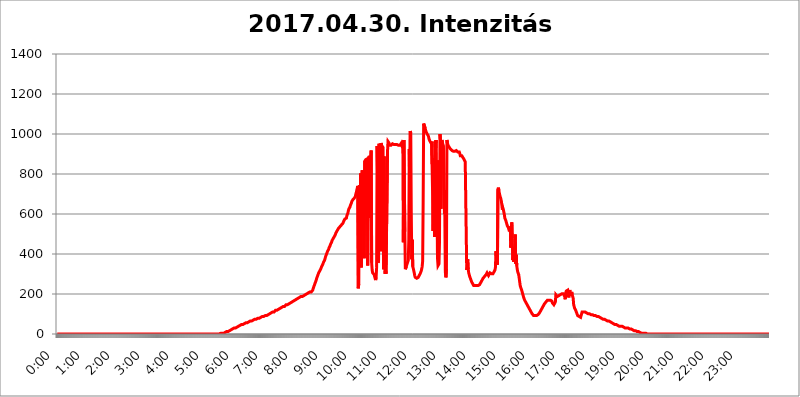
| Category | 2017.04.30. Intenzitás [W/m^2] |
|---|---|
| 0.0 | 0 |
| 0.0006944444444444445 | 0 |
| 0.001388888888888889 | 0 |
| 0.0020833333333333333 | 0 |
| 0.002777777777777778 | 0 |
| 0.003472222222222222 | 0 |
| 0.004166666666666667 | 0 |
| 0.004861111111111111 | 0 |
| 0.005555555555555556 | 0 |
| 0.0062499999999999995 | 0 |
| 0.006944444444444444 | 0 |
| 0.007638888888888889 | 0 |
| 0.008333333333333333 | 0 |
| 0.009027777777777779 | 0 |
| 0.009722222222222222 | 0 |
| 0.010416666666666666 | 0 |
| 0.011111111111111112 | 0 |
| 0.011805555555555555 | 0 |
| 0.012499999999999999 | 0 |
| 0.013194444444444444 | 0 |
| 0.013888888888888888 | 0 |
| 0.014583333333333332 | 0 |
| 0.015277777777777777 | 0 |
| 0.015972222222222224 | 0 |
| 0.016666666666666666 | 0 |
| 0.017361111111111112 | 0 |
| 0.018055555555555557 | 0 |
| 0.01875 | 0 |
| 0.019444444444444445 | 0 |
| 0.02013888888888889 | 0 |
| 0.020833333333333332 | 0 |
| 0.02152777777777778 | 0 |
| 0.022222222222222223 | 0 |
| 0.02291666666666667 | 0 |
| 0.02361111111111111 | 0 |
| 0.024305555555555556 | 0 |
| 0.024999999999999998 | 0 |
| 0.025694444444444447 | 0 |
| 0.02638888888888889 | 0 |
| 0.027083333333333334 | 0 |
| 0.027777777777777776 | 0 |
| 0.02847222222222222 | 0 |
| 0.029166666666666664 | 0 |
| 0.029861111111111113 | 0 |
| 0.030555555555555555 | 0 |
| 0.03125 | 0 |
| 0.03194444444444445 | 0 |
| 0.03263888888888889 | 0 |
| 0.03333333333333333 | 0 |
| 0.034027777777777775 | 0 |
| 0.034722222222222224 | 0 |
| 0.035416666666666666 | 0 |
| 0.036111111111111115 | 0 |
| 0.03680555555555556 | 0 |
| 0.0375 | 0 |
| 0.03819444444444444 | 0 |
| 0.03888888888888889 | 0 |
| 0.03958333333333333 | 0 |
| 0.04027777777777778 | 0 |
| 0.04097222222222222 | 0 |
| 0.041666666666666664 | 0 |
| 0.042361111111111106 | 0 |
| 0.04305555555555556 | 0 |
| 0.043750000000000004 | 0 |
| 0.044444444444444446 | 0 |
| 0.04513888888888889 | 0 |
| 0.04583333333333334 | 0 |
| 0.04652777777777778 | 0 |
| 0.04722222222222222 | 0 |
| 0.04791666666666666 | 0 |
| 0.04861111111111111 | 0 |
| 0.049305555555555554 | 0 |
| 0.049999999999999996 | 0 |
| 0.05069444444444445 | 0 |
| 0.051388888888888894 | 0 |
| 0.052083333333333336 | 0 |
| 0.05277777777777778 | 0 |
| 0.05347222222222222 | 0 |
| 0.05416666666666667 | 0 |
| 0.05486111111111111 | 0 |
| 0.05555555555555555 | 0 |
| 0.05625 | 0 |
| 0.05694444444444444 | 0 |
| 0.057638888888888885 | 0 |
| 0.05833333333333333 | 0 |
| 0.05902777777777778 | 0 |
| 0.059722222222222225 | 0 |
| 0.06041666666666667 | 0 |
| 0.061111111111111116 | 0 |
| 0.06180555555555556 | 0 |
| 0.0625 | 0 |
| 0.06319444444444444 | 0 |
| 0.06388888888888888 | 0 |
| 0.06458333333333334 | 0 |
| 0.06527777777777778 | 0 |
| 0.06597222222222222 | 0 |
| 0.06666666666666667 | 0 |
| 0.06736111111111111 | 0 |
| 0.06805555555555555 | 0 |
| 0.06874999999999999 | 0 |
| 0.06944444444444443 | 0 |
| 0.07013888888888889 | 0 |
| 0.07083333333333333 | 0 |
| 0.07152777777777779 | 0 |
| 0.07222222222222223 | 0 |
| 0.07291666666666667 | 0 |
| 0.07361111111111111 | 0 |
| 0.07430555555555556 | 0 |
| 0.075 | 0 |
| 0.07569444444444444 | 0 |
| 0.0763888888888889 | 0 |
| 0.07708333333333334 | 0 |
| 0.07777777777777778 | 0 |
| 0.07847222222222222 | 0 |
| 0.07916666666666666 | 0 |
| 0.0798611111111111 | 0 |
| 0.08055555555555556 | 0 |
| 0.08125 | 0 |
| 0.08194444444444444 | 0 |
| 0.08263888888888889 | 0 |
| 0.08333333333333333 | 0 |
| 0.08402777777777777 | 0 |
| 0.08472222222222221 | 0 |
| 0.08541666666666665 | 0 |
| 0.08611111111111112 | 0 |
| 0.08680555555555557 | 0 |
| 0.08750000000000001 | 0 |
| 0.08819444444444445 | 0 |
| 0.08888888888888889 | 0 |
| 0.08958333333333333 | 0 |
| 0.09027777777777778 | 0 |
| 0.09097222222222222 | 0 |
| 0.09166666666666667 | 0 |
| 0.09236111111111112 | 0 |
| 0.09305555555555556 | 0 |
| 0.09375 | 0 |
| 0.09444444444444444 | 0 |
| 0.09513888888888888 | 0 |
| 0.09583333333333333 | 0 |
| 0.09652777777777777 | 0 |
| 0.09722222222222222 | 0 |
| 0.09791666666666667 | 0 |
| 0.09861111111111111 | 0 |
| 0.09930555555555555 | 0 |
| 0.09999999999999999 | 0 |
| 0.10069444444444443 | 0 |
| 0.1013888888888889 | 0 |
| 0.10208333333333335 | 0 |
| 0.10277777777777779 | 0 |
| 0.10347222222222223 | 0 |
| 0.10416666666666667 | 0 |
| 0.10486111111111111 | 0 |
| 0.10555555555555556 | 0 |
| 0.10625 | 0 |
| 0.10694444444444444 | 0 |
| 0.1076388888888889 | 0 |
| 0.10833333333333334 | 0 |
| 0.10902777777777778 | 0 |
| 0.10972222222222222 | 0 |
| 0.1111111111111111 | 0 |
| 0.11180555555555556 | 0 |
| 0.11180555555555556 | 0 |
| 0.1125 | 0 |
| 0.11319444444444444 | 0 |
| 0.11388888888888889 | 0 |
| 0.11458333333333333 | 0 |
| 0.11527777777777777 | 0 |
| 0.11597222222222221 | 0 |
| 0.11666666666666665 | 0 |
| 0.1173611111111111 | 0 |
| 0.11805555555555557 | 0 |
| 0.11944444444444445 | 0 |
| 0.12013888888888889 | 0 |
| 0.12083333333333333 | 0 |
| 0.12152777777777778 | 0 |
| 0.12222222222222223 | 0 |
| 0.12291666666666667 | 0 |
| 0.12291666666666667 | 0 |
| 0.12361111111111112 | 0 |
| 0.12430555555555556 | 0 |
| 0.125 | 0 |
| 0.12569444444444444 | 0 |
| 0.12638888888888888 | 0 |
| 0.12708333333333333 | 0 |
| 0.16875 | 0 |
| 0.12847222222222224 | 0 |
| 0.12916666666666668 | 0 |
| 0.12986111111111112 | 0 |
| 0.13055555555555556 | 0 |
| 0.13125 | 0 |
| 0.13194444444444445 | 0 |
| 0.1326388888888889 | 0 |
| 0.13333333333333333 | 0 |
| 0.13402777777777777 | 0 |
| 0.13402777777777777 | 0 |
| 0.13472222222222222 | 0 |
| 0.13541666666666666 | 0 |
| 0.1361111111111111 | 0 |
| 0.13749999999999998 | 0 |
| 0.13819444444444443 | 0 |
| 0.1388888888888889 | 0 |
| 0.13958333333333334 | 0 |
| 0.14027777777777778 | 0 |
| 0.14097222222222222 | 0 |
| 0.14166666666666666 | 0 |
| 0.1423611111111111 | 0 |
| 0.14305555555555557 | 0 |
| 0.14375000000000002 | 0 |
| 0.14444444444444446 | 0 |
| 0.1451388888888889 | 0 |
| 0.1451388888888889 | 0 |
| 0.14652777777777778 | 0 |
| 0.14722222222222223 | 0 |
| 0.14791666666666667 | 0 |
| 0.1486111111111111 | 0 |
| 0.14930555555555555 | 0 |
| 0.15 | 0 |
| 0.15069444444444444 | 0 |
| 0.15138888888888888 | 0 |
| 0.15208333333333332 | 0 |
| 0.15277777777777776 | 0 |
| 0.15347222222222223 | 0 |
| 0.15416666666666667 | 0 |
| 0.15486111111111112 | 0 |
| 0.15555555555555556 | 0 |
| 0.15625 | 0 |
| 0.15694444444444444 | 0 |
| 0.15763888888888888 | 0 |
| 0.15833333333333333 | 0 |
| 0.15902777777777777 | 0 |
| 0.15972222222222224 | 0 |
| 0.16041666666666668 | 0 |
| 0.16111111111111112 | 0 |
| 0.16180555555555556 | 0 |
| 0.1625 | 0 |
| 0.16319444444444445 | 0 |
| 0.1638888888888889 | 0 |
| 0.16458333333333333 | 0 |
| 0.16527777777777777 | 0 |
| 0.16597222222222222 | 0 |
| 0.16666666666666666 | 0 |
| 0.1673611111111111 | 0 |
| 0.16805555555555554 | 0 |
| 0.16874999999999998 | 0 |
| 0.16944444444444443 | 0 |
| 0.17013888888888887 | 0 |
| 0.1708333333333333 | 0 |
| 0.17152777777777775 | 0 |
| 0.17222222222222225 | 0 |
| 0.1729166666666667 | 0 |
| 0.17361111111111113 | 0 |
| 0.17430555555555557 | 0 |
| 0.17500000000000002 | 0 |
| 0.17569444444444446 | 0 |
| 0.1763888888888889 | 0 |
| 0.17708333333333334 | 0 |
| 0.17777777777777778 | 0 |
| 0.17847222222222223 | 0 |
| 0.17916666666666667 | 0 |
| 0.1798611111111111 | 0 |
| 0.18055555555555555 | 0 |
| 0.18125 | 0 |
| 0.18194444444444444 | 0 |
| 0.1826388888888889 | 0 |
| 0.18333333333333335 | 0 |
| 0.1840277777777778 | 0 |
| 0.18472222222222223 | 0 |
| 0.18541666666666667 | 0 |
| 0.18611111111111112 | 0 |
| 0.18680555555555556 | 0 |
| 0.1875 | 0 |
| 0.18819444444444444 | 0 |
| 0.18888888888888888 | 0 |
| 0.18958333333333333 | 0 |
| 0.19027777777777777 | 0 |
| 0.1909722222222222 | 0 |
| 0.19166666666666665 | 0 |
| 0.19236111111111112 | 0 |
| 0.19305555555555554 | 0 |
| 0.19375 | 0 |
| 0.19444444444444445 | 0 |
| 0.1951388888888889 | 0 |
| 0.19583333333333333 | 0 |
| 0.19652777777777777 | 0 |
| 0.19722222222222222 | 0 |
| 0.19791666666666666 | 0 |
| 0.1986111111111111 | 0 |
| 0.19930555555555554 | 0 |
| 0.19999999999999998 | 0 |
| 0.20069444444444443 | 0 |
| 0.20138888888888887 | 0 |
| 0.2020833333333333 | 0 |
| 0.2027777777777778 | 0 |
| 0.2034722222222222 | 0 |
| 0.2041666666666667 | 0 |
| 0.20486111111111113 | 0 |
| 0.20555555555555557 | 0 |
| 0.20625000000000002 | 0 |
| 0.20694444444444446 | 0 |
| 0.2076388888888889 | 0 |
| 0.20833333333333334 | 0 |
| 0.20902777777777778 | 0 |
| 0.20972222222222223 | 0 |
| 0.21041666666666667 | 0 |
| 0.2111111111111111 | 0 |
| 0.21180555555555555 | 0 |
| 0.2125 | 0 |
| 0.21319444444444444 | 0 |
| 0.2138888888888889 | 0 |
| 0.21458333333333335 | 0 |
| 0.2152777777777778 | 0 |
| 0.21597222222222223 | 0 |
| 0.21666666666666667 | 0 |
| 0.21736111111111112 | 0 |
| 0.21805555555555556 | 0 |
| 0.21875 | 0 |
| 0.21944444444444444 | 0 |
| 0.22013888888888888 | 0 |
| 0.22083333333333333 | 0 |
| 0.22152777777777777 | 0 |
| 0.2222222222222222 | 0 |
| 0.22291666666666665 | 0 |
| 0.2236111111111111 | 0 |
| 0.22430555555555556 | 0 |
| 0.225 | 0 |
| 0.22569444444444445 | 0 |
| 0.2263888888888889 | 0 |
| 0.22708333333333333 | 0 |
| 0.22777777777777777 | 3.525 |
| 0.22847222222222222 | 3.525 |
| 0.22916666666666666 | 3.525 |
| 0.2298611111111111 | 3.525 |
| 0.23055555555555554 | 3.525 |
| 0.23124999999999998 | 3.525 |
| 0.23194444444444443 | 3.525 |
| 0.23263888888888887 | 3.525 |
| 0.2333333333333333 | 3.525 |
| 0.2340277777777778 | 7.887 |
| 0.2347222222222222 | 7.887 |
| 0.2354166666666667 | 7.887 |
| 0.23611111111111113 | 7.887 |
| 0.23680555555555557 | 12.257 |
| 0.23750000000000002 | 12.257 |
| 0.23819444444444446 | 12.257 |
| 0.2388888888888889 | 12.257 |
| 0.23958333333333334 | 12.257 |
| 0.24027777777777778 | 16.636 |
| 0.24097222222222223 | 16.636 |
| 0.24166666666666667 | 16.636 |
| 0.2423611111111111 | 16.636 |
| 0.24305555555555555 | 21.024 |
| 0.24375 | 21.024 |
| 0.24444444444444446 | 21.024 |
| 0.24513888888888888 | 21.024 |
| 0.24583333333333335 | 25.419 |
| 0.2465277777777778 | 25.419 |
| 0.24722222222222223 | 25.419 |
| 0.24791666666666667 | 29.823 |
| 0.24861111111111112 | 29.823 |
| 0.24930555555555556 | 29.823 |
| 0.25 | 29.823 |
| 0.25069444444444444 | 29.823 |
| 0.2513888888888889 | 34.234 |
| 0.2520833333333333 | 34.234 |
| 0.25277777777777777 | 38.653 |
| 0.2534722222222222 | 38.653 |
| 0.25416666666666665 | 38.653 |
| 0.2548611111111111 | 38.653 |
| 0.2555555555555556 | 38.653 |
| 0.25625000000000003 | 43.079 |
| 0.2569444444444445 | 43.079 |
| 0.2576388888888889 | 43.079 |
| 0.25833333333333336 | 47.511 |
| 0.2590277777777778 | 47.511 |
| 0.25972222222222224 | 47.511 |
| 0.2604166666666667 | 47.511 |
| 0.2611111111111111 | 47.511 |
| 0.26180555555555557 | 51.951 |
| 0.2625 | 51.951 |
| 0.26319444444444445 | 51.951 |
| 0.2638888888888889 | 56.398 |
| 0.26458333333333334 | 56.398 |
| 0.2652777777777778 | 56.398 |
| 0.2659722222222222 | 56.398 |
| 0.26666666666666666 | 56.398 |
| 0.2673611111111111 | 60.85 |
| 0.26805555555555555 | 60.85 |
| 0.26875 | 60.85 |
| 0.26944444444444443 | 60.85 |
| 0.2701388888888889 | 65.31 |
| 0.2708333333333333 | 65.31 |
| 0.27152777777777776 | 65.31 |
| 0.2722222222222222 | 65.31 |
| 0.27291666666666664 | 65.31 |
| 0.2736111111111111 | 69.775 |
| 0.2743055555555555 | 69.775 |
| 0.27499999999999997 | 69.775 |
| 0.27569444444444446 | 74.246 |
| 0.27638888888888885 | 74.246 |
| 0.27708333333333335 | 74.246 |
| 0.2777777777777778 | 74.246 |
| 0.27847222222222223 | 74.246 |
| 0.2791666666666667 | 74.246 |
| 0.2798611111111111 | 74.246 |
| 0.28055555555555556 | 74.246 |
| 0.28125 | 78.722 |
| 0.28194444444444444 | 78.722 |
| 0.2826388888888889 | 78.722 |
| 0.2833333333333333 | 78.722 |
| 0.28402777777777777 | 83.205 |
| 0.2847222222222222 | 83.205 |
| 0.28541666666666665 | 83.205 |
| 0.28611111111111115 | 83.205 |
| 0.28680555555555554 | 83.205 |
| 0.28750000000000003 | 87.692 |
| 0.2881944444444445 | 87.692 |
| 0.2888888888888889 | 87.692 |
| 0.28958333333333336 | 87.692 |
| 0.2902777777777778 | 87.692 |
| 0.29097222222222224 | 92.184 |
| 0.2916666666666667 | 92.184 |
| 0.2923611111111111 | 92.184 |
| 0.29305555555555557 | 92.184 |
| 0.29375 | 92.184 |
| 0.29444444444444445 | 96.682 |
| 0.2951388888888889 | 96.682 |
| 0.29583333333333334 | 96.682 |
| 0.2965277777777778 | 101.184 |
| 0.2972222222222222 | 101.184 |
| 0.29791666666666666 | 101.184 |
| 0.2986111111111111 | 101.184 |
| 0.29930555555555555 | 101.184 |
| 0.3 | 105.69 |
| 0.30069444444444443 | 105.69 |
| 0.3013888888888889 | 110.201 |
| 0.3020833333333333 | 110.201 |
| 0.30277777777777776 | 110.201 |
| 0.3034722222222222 | 110.201 |
| 0.30416666666666664 | 110.201 |
| 0.3048611111111111 | 114.716 |
| 0.3055555555555555 | 114.716 |
| 0.30624999999999997 | 119.235 |
| 0.3069444444444444 | 119.235 |
| 0.3076388888888889 | 119.235 |
| 0.30833333333333335 | 119.235 |
| 0.3090277777777778 | 119.235 |
| 0.30972222222222223 | 119.235 |
| 0.3104166666666667 | 123.758 |
| 0.3111111111111111 | 123.758 |
| 0.31180555555555556 | 123.758 |
| 0.3125 | 128.284 |
| 0.31319444444444444 | 128.284 |
| 0.3138888888888889 | 128.284 |
| 0.3145833333333333 | 132.814 |
| 0.31527777777777777 | 132.814 |
| 0.3159722222222222 | 132.814 |
| 0.31666666666666665 | 137.347 |
| 0.31736111111111115 | 137.347 |
| 0.31805555555555554 | 137.347 |
| 0.31875000000000003 | 137.347 |
| 0.3194444444444445 | 141.884 |
| 0.3201388888888889 | 141.884 |
| 0.32083333333333336 | 146.423 |
| 0.3215277777777778 | 146.423 |
| 0.32222222222222224 | 146.423 |
| 0.3229166666666667 | 146.423 |
| 0.3236111111111111 | 146.423 |
| 0.32430555555555557 | 150.964 |
| 0.325 | 150.964 |
| 0.32569444444444445 | 155.509 |
| 0.3263888888888889 | 155.509 |
| 0.32708333333333334 | 155.509 |
| 0.3277777777777778 | 155.509 |
| 0.3284722222222222 | 160.056 |
| 0.32916666666666666 | 160.056 |
| 0.3298611111111111 | 160.056 |
| 0.33055555555555555 | 164.605 |
| 0.33125 | 164.605 |
| 0.33194444444444443 | 164.605 |
| 0.3326388888888889 | 164.605 |
| 0.3333333333333333 | 169.156 |
| 0.3340277777777778 | 169.156 |
| 0.3347222222222222 | 173.709 |
| 0.3354166666666667 | 173.709 |
| 0.3361111111111111 | 173.709 |
| 0.3368055555555556 | 173.709 |
| 0.33749999999999997 | 178.264 |
| 0.33819444444444446 | 178.264 |
| 0.33888888888888885 | 182.82 |
| 0.33958333333333335 | 182.82 |
| 0.34027777777777773 | 182.82 |
| 0.34097222222222223 | 182.82 |
| 0.3416666666666666 | 187.378 |
| 0.3423611111111111 | 187.378 |
| 0.3430555555555555 | 187.378 |
| 0.34375 | 187.378 |
| 0.3444444444444445 | 191.937 |
| 0.3451388888888889 | 191.937 |
| 0.3458333333333334 | 191.937 |
| 0.34652777777777777 | 191.937 |
| 0.34722222222222227 | 196.497 |
| 0.34791666666666665 | 196.497 |
| 0.34861111111111115 | 196.497 |
| 0.34930555555555554 | 201.058 |
| 0.35000000000000003 | 201.058 |
| 0.3506944444444444 | 201.058 |
| 0.3513888888888889 | 205.62 |
| 0.3520833333333333 | 205.62 |
| 0.3527777777777778 | 205.62 |
| 0.3534722222222222 | 205.62 |
| 0.3541666666666667 | 210.182 |
| 0.3548611111111111 | 210.182 |
| 0.35555555555555557 | 210.182 |
| 0.35625 | 210.182 |
| 0.35694444444444445 | 214.746 |
| 0.3576388888888889 | 214.746 |
| 0.35833333333333334 | 219.309 |
| 0.3590277777777778 | 228.436 |
| 0.3597222222222222 | 233 |
| 0.36041666666666666 | 242.127 |
| 0.3611111111111111 | 246.689 |
| 0.36180555555555555 | 255.813 |
| 0.3625 | 260.373 |
| 0.36319444444444443 | 269.49 |
| 0.3638888888888889 | 278.603 |
| 0.3645833333333333 | 283.156 |
| 0.3652777777777778 | 292.259 |
| 0.3659722222222222 | 296.808 |
| 0.3666666666666667 | 305.898 |
| 0.3673611111111111 | 310.44 |
| 0.3680555555555556 | 314.98 |
| 0.36874999999999997 | 319.517 |
| 0.36944444444444446 | 324.052 |
| 0.37013888888888885 | 328.584 |
| 0.37083333333333335 | 337.639 |
| 0.37152777777777773 | 342.162 |
| 0.37222222222222223 | 346.682 |
| 0.3729166666666666 | 351.198 |
| 0.3736111111111111 | 360.221 |
| 0.3743055555555555 | 364.728 |
| 0.375 | 369.23 |
| 0.3756944444444445 | 378.224 |
| 0.3763888888888889 | 387.202 |
| 0.3770833333333334 | 391.685 |
| 0.37777777777777777 | 400.638 |
| 0.37847222222222227 | 405.108 |
| 0.37916666666666665 | 414.035 |
| 0.37986111111111115 | 418.492 |
| 0.38055555555555554 | 422.943 |
| 0.38125000000000003 | 431.833 |
| 0.3819444444444444 | 436.27 |
| 0.3826388888888889 | 440.702 |
| 0.3833333333333333 | 449.551 |
| 0.3840277777777778 | 453.968 |
| 0.3847222222222222 | 458.38 |
| 0.3854166666666667 | 467.187 |
| 0.3861111111111111 | 471.582 |
| 0.38680555555555557 | 475.972 |
| 0.3875 | 480.356 |
| 0.38819444444444445 | 484.735 |
| 0.3888888888888889 | 489.108 |
| 0.38958333333333334 | 493.475 |
| 0.3902777777777778 | 497.836 |
| 0.3909722222222222 | 506.542 |
| 0.39166666666666666 | 506.542 |
| 0.3923611111111111 | 515.223 |
| 0.39305555555555555 | 515.223 |
| 0.39375 | 519.555 |
| 0.39444444444444443 | 528.2 |
| 0.3951388888888889 | 528.2 |
| 0.3958333333333333 | 532.513 |
| 0.3965277777777778 | 536.82 |
| 0.3972222222222222 | 536.82 |
| 0.3979166666666667 | 541.121 |
| 0.3986111111111111 | 545.416 |
| 0.3993055555555556 | 549.704 |
| 0.39999999999999997 | 549.704 |
| 0.40069444444444446 | 553.986 |
| 0.40138888888888885 | 558.261 |
| 0.40208333333333335 | 566.793 |
| 0.40277777777777773 | 571.049 |
| 0.40347222222222223 | 575.299 |
| 0.4041666666666666 | 575.299 |
| 0.4048611111111111 | 575.299 |
| 0.4055555555555555 | 579.542 |
| 0.40625 | 592.233 |
| 0.4069444444444445 | 592.233 |
| 0.4076388888888889 | 604.864 |
| 0.4083333333333334 | 617.436 |
| 0.40902777777777777 | 625.784 |
| 0.40972222222222227 | 625.784 |
| 0.41041666666666665 | 634.105 |
| 0.41111111111111115 | 642.4 |
| 0.41180555555555554 | 646.537 |
| 0.41250000000000003 | 654.791 |
| 0.4131944444444444 | 663.019 |
| 0.4138888888888889 | 667.123 |
| 0.4145833333333333 | 671.22 |
| 0.4152777777777778 | 675.311 |
| 0.4159722222222222 | 675.311 |
| 0.4166666666666667 | 679.395 |
| 0.4173611111111111 | 683.473 |
| 0.41805555555555557 | 687.544 |
| 0.41875 | 699.717 |
| 0.41944444444444445 | 707.8 |
| 0.4201388888888889 | 719.877 |
| 0.42083333333333334 | 723.889 |
| 0.4215277777777778 | 739.877 |
| 0.4222222222222222 | 228.436 |
| 0.42291666666666666 | 251.251 |
| 0.4236111111111111 | 743.859 |
| 0.42430555555555555 | 414.035 |
| 0.425 | 400.638 |
| 0.42569444444444443 | 802.868 |
| 0.4263888888888889 | 333.113 |
| 0.4270833333333333 | 763.674 |
| 0.4277777777777778 | 818.392 |
| 0.4284722222222222 | 755.766 |
| 0.4291666666666667 | 814.519 |
| 0.4298611111111111 | 791.169 |
| 0.4305555555555556 | 378.224 |
| 0.43124999999999997 | 864.493 |
| 0.43194444444444446 | 868.305 |
| 0.43263888888888885 | 872.114 |
| 0.43333333333333335 | 868.305 |
| 0.43402777777777773 | 868.305 |
| 0.43472222222222223 | 875.918 |
| 0.4354166666666666 | 342.162 |
| 0.4361111111111111 | 751.803 |
| 0.4368055555555555 | 822.26 |
| 0.4375 | 891.099 |
| 0.4381944444444445 | 868.305 |
| 0.4388888888888889 | 579.542 |
| 0.4395833333333334 | 883.516 |
| 0.44027777777777777 | 917.534 |
| 0.44097222222222227 | 355.712 |
| 0.44166666666666665 | 319.517 |
| 0.44236111111111115 | 305.898 |
| 0.44305555555555554 | 305.898 |
| 0.44375000000000003 | 305.898 |
| 0.4444444444444444 | 296.808 |
| 0.4451388888888889 | 292.259 |
| 0.4458333333333333 | 278.603 |
| 0.4465277777777778 | 269.49 |
| 0.4472222222222222 | 283.156 |
| 0.4479166666666667 | 333.113 |
| 0.4486111111111111 | 940.082 |
| 0.44930555555555557 | 783.342 |
| 0.45 | 355.712 |
| 0.45069444444444445 | 369.23 |
| 0.4513888888888889 | 951.327 |
| 0.45208333333333334 | 687.544 |
| 0.4527777777777778 | 583.779 |
| 0.4534722222222222 | 414.035 |
| 0.45416666666666666 | 955.071 |
| 0.4548611111111111 | 943.832 |
| 0.45555555555555555 | 940.082 |
| 0.45625 | 940.082 |
| 0.45694444444444443 | 932.576 |
| 0.4576388888888889 | 324.052 |
| 0.4583333333333333 | 887.309 |
| 0.4590277777777778 | 369.23 |
| 0.4597222222222222 | 301.354 |
| 0.4604166666666667 | 319.517 |
| 0.4611111111111111 | 301.354 |
| 0.4618055555555556 | 305.898 |
| 0.46249999999999997 | 296.808 |
| 0.46319444444444446 | 909.996 |
| 0.46388888888888885 | 962.555 |
| 0.46458333333333335 | 962.555 |
| 0.46527777777777773 | 955.071 |
| 0.46597222222222223 | 943.832 |
| 0.4666666666666666 | 947.58 |
| 0.4673611111111111 | 947.58 |
| 0.4680555555555555 | 943.832 |
| 0.46875 | 940.082 |
| 0.4694444444444445 | 947.58 |
| 0.4701388888888889 | 951.327 |
| 0.4708333333333334 | 955.071 |
| 0.47152777777777777 | 951.327 |
| 0.47222222222222227 | 947.58 |
| 0.47291666666666665 | 947.58 |
| 0.47361111111111115 | 947.58 |
| 0.47430555555555554 | 947.58 |
| 0.47500000000000003 | 947.58 |
| 0.4756944444444444 | 947.58 |
| 0.4763888888888889 | 947.58 |
| 0.4770833333333333 | 947.58 |
| 0.4777777777777778 | 943.832 |
| 0.4784722222222222 | 943.832 |
| 0.4791666666666667 | 943.832 |
| 0.4798611111111111 | 947.58 |
| 0.48055555555555557 | 943.832 |
| 0.48125 | 947.58 |
| 0.48194444444444445 | 947.58 |
| 0.4826388888888889 | 955.071 |
| 0.48333333333333334 | 943.832 |
| 0.4840277777777778 | 947.58 |
| 0.4847222222222222 | 925.06 |
| 0.48541666666666666 | 458.38 |
| 0.4861111111111111 | 970.034 |
| 0.48680555555555555 | 973.772 |
| 0.4875 | 510.885 |
| 0.48819444444444443 | 324.052 |
| 0.4888888888888889 | 328.584 |
| 0.4895833333333333 | 337.639 |
| 0.4902777777777778 | 346.682 |
| 0.4909722222222222 | 342.162 |
| 0.4916666666666667 | 351.198 |
| 0.4923611111111111 | 369.23 |
| 0.4930555555555556 | 471.582 |
| 0.49374999999999997 | 925.06 |
| 0.49444444444444446 | 691.608 |
| 0.49513888888888885 | 1014.852 |
| 0.49583333333333335 | 1003.65 |
| 0.49652777777777773 | 609.062 |
| 0.49722222222222223 | 373.729 |
| 0.4979166666666666 | 471.582 |
| 0.4986111111111111 | 337.639 |
| 0.4993055555555555 | 328.584 |
| 0.5 | 324.052 |
| 0.5006944444444444 | 305.898 |
| 0.5013888888888889 | 292.259 |
| 0.5020833333333333 | 283.156 |
| 0.5027777777777778 | 278.603 |
| 0.5034722222222222 | 278.603 |
| 0.5041666666666667 | 278.603 |
| 0.5048611111111111 | 278.603 |
| 0.5055555555555555 | 278.603 |
| 0.50625 | 283.156 |
| 0.5069444444444444 | 287.709 |
| 0.5076388888888889 | 292.259 |
| 0.5083333333333333 | 296.808 |
| 0.5090277777777777 | 301.354 |
| 0.5097222222222222 | 305.898 |
| 0.5104166666666666 | 314.98 |
| 0.5111111111111112 | 324.052 |
| 0.5118055555555555 | 337.639 |
| 0.5125000000000001 | 364.728 |
| 0.5131944444444444 | 658.909 |
| 0.513888888888889 | 1052.255 |
| 0.5145833333333333 | 1048.508 |
| 0.5152777777777778 | 1048.508 |
| 0.5159722222222222 | 1029.798 |
| 0.5166666666666667 | 1018.587 |
| 0.517361111111111 | 1011.118 |
| 0.5180555555555556 | 1007.383 |
| 0.5187499999999999 | 999.916 |
| 0.5194444444444445 | 996.182 |
| 0.5201388888888888 | 992.448 |
| 0.5208333333333334 | 984.98 |
| 0.5215277777777778 | 973.772 |
| 0.5222222222222223 | 970.034 |
| 0.5229166666666667 | 962.555 |
| 0.5236111111111111 | 958.814 |
| 0.5243055555555556 | 955.071 |
| 0.525 | 962.555 |
| 0.5256944444444445 | 849.199 |
| 0.5263888888888889 | 715.858 |
| 0.5270833333333333 | 515.223 |
| 0.5277777777777778 | 879.719 |
| 0.5284722222222222 | 654.791 |
| 0.5291666666666667 | 484.735 |
| 0.5298611111111111 | 962.555 |
| 0.5305555555555556 | 921.298 |
| 0.53125 | 970.034 |
| 0.5319444444444444 | 519.555 |
| 0.5326388888888889 | 868.305 |
| 0.5333333333333333 | 378.224 |
| 0.5340277777777778 | 342.162 |
| 0.5347222222222222 | 337.639 |
| 0.5354166666666667 | 351.198 |
| 0.5361111111111111 | 458.38 |
| 0.5368055555555555 | 999.916 |
| 0.5375 | 970.034 |
| 0.5381944444444444 | 625.784 |
| 0.5388888888888889 | 909.996 |
| 0.5395833333333333 | 970.034 |
| 0.5402777777777777 | 955.071 |
| 0.5409722222222222 | 947.58 |
| 0.5416666666666666 | 940.082 |
| 0.5423611111111112 | 936.33 |
| 0.5430555555555555 | 600.661 |
| 0.5437500000000001 | 719.877 |
| 0.5444444444444444 | 305.898 |
| 0.545138888888889 | 283.156 |
| 0.5458333333333333 | 324.052 |
| 0.5465277777777778 | 970.034 |
| 0.5472222222222222 | 955.071 |
| 0.5479166666666667 | 947.58 |
| 0.548611111111111 | 940.082 |
| 0.5493055555555556 | 936.33 |
| 0.5499999999999999 | 932.576 |
| 0.5506944444444445 | 928.819 |
| 0.5513888888888888 | 925.06 |
| 0.5520833333333334 | 921.298 |
| 0.5527777777777778 | 921.298 |
| 0.5534722222222223 | 917.534 |
| 0.5541666666666667 | 917.534 |
| 0.5548611111111111 | 917.534 |
| 0.5555555555555556 | 913.766 |
| 0.55625 | 913.766 |
| 0.5569444444444445 | 913.766 |
| 0.5576388888888889 | 913.766 |
| 0.5583333333333333 | 913.766 |
| 0.5590277777777778 | 913.766 |
| 0.5597222222222222 | 917.534 |
| 0.5604166666666667 | 917.534 |
| 0.5611111111111111 | 917.534 |
| 0.5618055555555556 | 909.996 |
| 0.5625 | 913.766 |
| 0.5631944444444444 | 913.766 |
| 0.5638888888888889 | 909.996 |
| 0.5645833333333333 | 902.447 |
| 0.5652777777777778 | 891.099 |
| 0.5659722222222222 | 891.099 |
| 0.5666666666666667 | 894.885 |
| 0.5673611111111111 | 891.099 |
| 0.5680555555555555 | 887.309 |
| 0.56875 | 883.516 |
| 0.5694444444444444 | 879.719 |
| 0.5701388888888889 | 875.918 |
| 0.5708333333333333 | 872.114 |
| 0.5715277777777777 | 872.114 |
| 0.5722222222222222 | 860.676 |
| 0.5729166666666666 | 856.855 |
| 0.5736111111111112 | 864.493 |
| 0.5743055555555555 | 319.517 |
| 0.5750000000000001 | 333.113 |
| 0.5756944444444444 | 373.729 |
| 0.576388888888889 | 324.052 |
| 0.5770833333333333 | 305.898 |
| 0.5777777777777778 | 296.808 |
| 0.5784722222222222 | 287.709 |
| 0.5791666666666667 | 283.156 |
| 0.579861111111111 | 274.047 |
| 0.5805555555555556 | 269.49 |
| 0.5812499999999999 | 260.373 |
| 0.5819444444444445 | 260.373 |
| 0.5826388888888888 | 251.251 |
| 0.5833333333333334 | 251.251 |
| 0.5840277777777778 | 242.127 |
| 0.5847222222222223 | 242.127 |
| 0.5854166666666667 | 242.127 |
| 0.5861111111111111 | 242.127 |
| 0.5868055555555556 | 242.127 |
| 0.5875 | 242.127 |
| 0.5881944444444445 | 242.127 |
| 0.5888888888888889 | 237.564 |
| 0.5895833333333333 | 237.564 |
| 0.5902777777777778 | 242.127 |
| 0.5909722222222222 | 242.127 |
| 0.5916666666666667 | 242.127 |
| 0.5923611111111111 | 246.689 |
| 0.5930555555555556 | 251.251 |
| 0.59375 | 251.251 |
| 0.5944444444444444 | 260.373 |
| 0.5951388888888889 | 264.932 |
| 0.5958333333333333 | 269.49 |
| 0.5965277777777778 | 274.047 |
| 0.5972222222222222 | 278.603 |
| 0.5979166666666667 | 283.156 |
| 0.5986111111111111 | 283.156 |
| 0.5993055555555555 | 287.709 |
| 0.6 | 287.709 |
| 0.6006944444444444 | 292.259 |
| 0.6013888888888889 | 296.808 |
| 0.6020833333333333 | 301.354 |
| 0.6027777777777777 | 305.898 |
| 0.6034722222222222 | 305.898 |
| 0.6041666666666666 | 301.354 |
| 0.6048611111111112 | 292.259 |
| 0.6055555555555555 | 292.259 |
| 0.6062500000000001 | 296.808 |
| 0.6069444444444444 | 305.898 |
| 0.607638888888889 | 310.44 |
| 0.6083333333333333 | 310.44 |
| 0.6090277777777778 | 301.354 |
| 0.6097222222222222 | 296.808 |
| 0.6104166666666667 | 296.808 |
| 0.611111111111111 | 301.354 |
| 0.6118055555555556 | 305.898 |
| 0.6124999999999999 | 310.44 |
| 0.6131944444444445 | 314.98 |
| 0.6138888888888888 | 319.517 |
| 0.6145833333333334 | 333.113 |
| 0.6152777777777778 | 414.035 |
| 0.6159722222222223 | 387.202 |
| 0.6166666666666667 | 391.685 |
| 0.6173611111111111 | 346.682 |
| 0.6180555555555556 | 723.889 |
| 0.61875 | 731.896 |
| 0.6194444444444445 | 715.858 |
| 0.6201388888888889 | 703.762 |
| 0.6208333333333333 | 691.608 |
| 0.6215277777777778 | 683.473 |
| 0.6222222222222222 | 675.311 |
| 0.6229166666666667 | 663.019 |
| 0.6236111111111111 | 642.4 |
| 0.6243055555555556 | 621.613 |
| 0.625 | 629.948 |
| 0.6256944444444444 | 621.613 |
| 0.6263888888888889 | 609.062 |
| 0.6270833333333333 | 596.45 |
| 0.6277777777777778 | 579.542 |
| 0.6284722222222222 | 575.299 |
| 0.6291666666666667 | 566.793 |
| 0.6298611111111111 | 558.261 |
| 0.6305555555555555 | 549.704 |
| 0.63125 | 541.121 |
| 0.6319444444444444 | 536.82 |
| 0.6326388888888889 | 532.513 |
| 0.6333333333333333 | 523.88 |
| 0.6340277777777777 | 519.555 |
| 0.6347222222222222 | 523.88 |
| 0.6354166666666666 | 532.513 |
| 0.6361111111111112 | 431.833 |
| 0.6368055555555555 | 506.542 |
| 0.6375000000000001 | 558.261 |
| 0.6381944444444444 | 480.356 |
| 0.638888888888889 | 369.23 |
| 0.6395833333333333 | 431.833 |
| 0.6402777777777778 | 360.221 |
| 0.6409722222222222 | 369.23 |
| 0.6416666666666667 | 400.638 |
| 0.642361111111111 | 497.836 |
| 0.6430555555555556 | 351.198 |
| 0.6437499999999999 | 396.164 |
| 0.6444444444444445 | 342.162 |
| 0.6451388888888888 | 324.052 |
| 0.6458333333333334 | 310.44 |
| 0.6465277777777778 | 305.898 |
| 0.6472222222222223 | 296.808 |
| 0.6479166666666667 | 278.603 |
| 0.6486111111111111 | 260.373 |
| 0.6493055555555556 | 242.127 |
| 0.65 | 233 |
| 0.6506944444444445 | 228.436 |
| 0.6513888888888889 | 219.309 |
| 0.6520833333333333 | 210.182 |
| 0.6527777777777778 | 201.058 |
| 0.6534722222222222 | 191.937 |
| 0.6541666666666667 | 182.82 |
| 0.6548611111111111 | 178.264 |
| 0.6555555555555556 | 169.156 |
| 0.65625 | 164.605 |
| 0.6569444444444444 | 160.056 |
| 0.6576388888888889 | 155.509 |
| 0.6583333333333333 | 150.964 |
| 0.6590277777777778 | 146.423 |
| 0.6597222222222222 | 141.884 |
| 0.6604166666666667 | 137.347 |
| 0.6611111111111111 | 132.814 |
| 0.6618055555555555 | 128.284 |
| 0.6625 | 128.284 |
| 0.6631944444444444 | 119.235 |
| 0.6638888888888889 | 114.716 |
| 0.6645833333333333 | 110.201 |
| 0.6652777777777777 | 105.69 |
| 0.6659722222222222 | 101.184 |
| 0.6666666666666666 | 101.184 |
| 0.6673611111111111 | 96.682 |
| 0.6680555555555556 | 92.184 |
| 0.6687500000000001 | 92.184 |
| 0.6694444444444444 | 92.184 |
| 0.6701388888888888 | 92.184 |
| 0.6708333333333334 | 87.692 |
| 0.6715277777777778 | 87.692 |
| 0.6722222222222222 | 92.184 |
| 0.6729166666666666 | 92.184 |
| 0.6736111111111112 | 92.184 |
| 0.6743055555555556 | 96.682 |
| 0.6749999999999999 | 96.682 |
| 0.6756944444444444 | 101.184 |
| 0.6763888888888889 | 105.69 |
| 0.6770833333333334 | 110.201 |
| 0.6777777777777777 | 114.716 |
| 0.6784722222222223 | 119.235 |
| 0.6791666666666667 | 123.758 |
| 0.6798611111111111 | 128.284 |
| 0.6805555555555555 | 132.814 |
| 0.68125 | 137.347 |
| 0.6819444444444445 | 141.884 |
| 0.6826388888888889 | 146.423 |
| 0.6833333333333332 | 150.964 |
| 0.6840277777777778 | 155.509 |
| 0.6847222222222222 | 155.509 |
| 0.6854166666666667 | 160.056 |
| 0.686111111111111 | 164.605 |
| 0.6868055555555556 | 164.605 |
| 0.6875 | 169.156 |
| 0.6881944444444444 | 169.156 |
| 0.688888888888889 | 173.709 |
| 0.6895833333333333 | 169.156 |
| 0.6902777777777778 | 169.156 |
| 0.6909722222222222 | 169.156 |
| 0.6916666666666668 | 169.156 |
| 0.6923611111111111 | 164.605 |
| 0.6930555555555555 | 164.605 |
| 0.69375 | 164.605 |
| 0.6944444444444445 | 155.509 |
| 0.6951388888888889 | 155.509 |
| 0.6958333333333333 | 150.964 |
| 0.6965277777777777 | 146.423 |
| 0.6972222222222223 | 146.423 |
| 0.6979166666666666 | 146.423 |
| 0.6986111111111111 | 160.056 |
| 0.6993055555555556 | 196.497 |
| 0.7000000000000001 | 196.497 |
| 0.7006944444444444 | 191.937 |
| 0.7013888888888888 | 187.378 |
| 0.7020833333333334 | 182.82 |
| 0.7027777777777778 | 187.378 |
| 0.7034722222222222 | 191.937 |
| 0.7041666666666666 | 191.937 |
| 0.7048611111111112 | 196.497 |
| 0.7055555555555556 | 196.497 |
| 0.7062499999999999 | 201.058 |
| 0.7069444444444444 | 201.058 |
| 0.7076388888888889 | 201.058 |
| 0.7083333333333334 | 205.62 |
| 0.7090277777777777 | 201.058 |
| 0.7097222222222223 | 201.058 |
| 0.7104166666666667 | 196.497 |
| 0.7111111111111111 | 201.058 |
| 0.7118055555555555 | 187.378 |
| 0.7125 | 173.709 |
| 0.7131944444444445 | 205.62 |
| 0.7138888888888889 | 214.746 |
| 0.7145833333333332 | 219.309 |
| 0.7152777777777778 | 214.746 |
| 0.7159722222222222 | 219.309 |
| 0.7166666666666667 | 196.497 |
| 0.717361111111111 | 182.82 |
| 0.7180555555555556 | 201.058 |
| 0.71875 | 219.309 |
| 0.7194444444444444 | 210.182 |
| 0.720138888888889 | 191.937 |
| 0.7208333333333333 | 187.378 |
| 0.7215277777777778 | 210.182 |
| 0.7222222222222222 | 196.497 |
| 0.7229166666666668 | 201.058 |
| 0.7236111111111111 | 178.264 |
| 0.7243055555555555 | 146.423 |
| 0.725 | 137.347 |
| 0.7256944444444445 | 128.284 |
| 0.7263888888888889 | 123.758 |
| 0.7270833333333333 | 119.235 |
| 0.7277777777777777 | 114.716 |
| 0.7284722222222223 | 105.69 |
| 0.7291666666666666 | 101.184 |
| 0.7298611111111111 | 92.184 |
| 0.7305555555555556 | 92.184 |
| 0.7312500000000001 | 87.692 |
| 0.7319444444444444 | 87.692 |
| 0.7326388888888888 | 83.205 |
| 0.7333333333333334 | 83.205 |
| 0.7340277777777778 | 83.205 |
| 0.7347222222222222 | 83.205 |
| 0.7354166666666666 | 83.205 |
| 0.7361111111111112 | 110.201 |
| 0.7368055555555556 | 114.716 |
| 0.7374999999999999 | 110.201 |
| 0.7381944444444444 | 110.201 |
| 0.7388888888888889 | 110.201 |
| 0.7395833333333334 | 110.201 |
| 0.7402777777777777 | 110.201 |
| 0.7409722222222223 | 105.69 |
| 0.7416666666666667 | 105.69 |
| 0.7423611111111111 | 105.69 |
| 0.7430555555555555 | 105.69 |
| 0.74375 | 105.69 |
| 0.7444444444444445 | 101.184 |
| 0.7451388888888889 | 105.69 |
| 0.7458333333333332 | 101.184 |
| 0.7465277777777778 | 101.184 |
| 0.7472222222222222 | 101.184 |
| 0.7479166666666667 | 101.184 |
| 0.748611111111111 | 96.682 |
| 0.7493055555555556 | 96.682 |
| 0.75 | 96.682 |
| 0.7506944444444444 | 96.682 |
| 0.751388888888889 | 96.682 |
| 0.7520833333333333 | 96.682 |
| 0.7527777777777778 | 92.184 |
| 0.7534722222222222 | 92.184 |
| 0.7541666666666668 | 92.184 |
| 0.7548611111111111 | 92.184 |
| 0.7555555555555555 | 92.184 |
| 0.75625 | 92.184 |
| 0.7569444444444445 | 87.692 |
| 0.7576388888888889 | 87.692 |
| 0.7583333333333333 | 87.692 |
| 0.7590277777777777 | 87.692 |
| 0.7597222222222223 | 83.205 |
| 0.7604166666666666 | 83.205 |
| 0.7611111111111111 | 83.205 |
| 0.7618055555555556 | 83.205 |
| 0.7625000000000001 | 83.205 |
| 0.7631944444444444 | 78.722 |
| 0.7638888888888888 | 78.722 |
| 0.7645833333333334 | 78.722 |
| 0.7652777777777778 | 74.246 |
| 0.7659722222222222 | 74.246 |
| 0.7666666666666666 | 74.246 |
| 0.7673611111111112 | 74.246 |
| 0.7680555555555556 | 74.246 |
| 0.7687499999999999 | 69.775 |
| 0.7694444444444444 | 69.775 |
| 0.7701388888888889 | 69.775 |
| 0.7708333333333334 | 69.775 |
| 0.7715277777777777 | 65.31 |
| 0.7722222222222223 | 65.31 |
| 0.7729166666666667 | 65.31 |
| 0.7736111111111111 | 65.31 |
| 0.7743055555555555 | 60.85 |
| 0.775 | 60.85 |
| 0.7756944444444445 | 60.85 |
| 0.7763888888888889 | 56.398 |
| 0.7770833333333332 | 56.398 |
| 0.7777777777777778 | 56.398 |
| 0.7784722222222222 | 56.398 |
| 0.7791666666666667 | 51.951 |
| 0.779861111111111 | 51.951 |
| 0.7805555555555556 | 51.951 |
| 0.78125 | 47.511 |
| 0.7819444444444444 | 47.511 |
| 0.782638888888889 | 47.511 |
| 0.7833333333333333 | 47.511 |
| 0.7840277777777778 | 47.511 |
| 0.7847222222222222 | 47.511 |
| 0.7854166666666668 | 43.079 |
| 0.7861111111111111 | 43.079 |
| 0.7868055555555555 | 43.079 |
| 0.7875 | 43.079 |
| 0.7881944444444445 | 38.653 |
| 0.7888888888888889 | 38.653 |
| 0.7895833333333333 | 38.653 |
| 0.7902777777777777 | 38.653 |
| 0.7909722222222223 | 38.653 |
| 0.7916666666666666 | 38.653 |
| 0.7923611111111111 | 38.653 |
| 0.7930555555555556 | 34.234 |
| 0.7937500000000001 | 34.234 |
| 0.7944444444444444 | 34.234 |
| 0.7951388888888888 | 34.234 |
| 0.7958333333333334 | 34.234 |
| 0.7965277777777778 | 29.823 |
| 0.7972222222222222 | 29.823 |
| 0.7979166666666666 | 29.823 |
| 0.7986111111111112 | 29.823 |
| 0.7993055555555556 | 29.823 |
| 0.7999999999999999 | 29.823 |
| 0.8006944444444444 | 29.823 |
| 0.8013888888888889 | 29.823 |
| 0.8020833333333334 | 29.823 |
| 0.8027777777777777 | 25.419 |
| 0.8034722222222223 | 25.419 |
| 0.8041666666666667 | 25.419 |
| 0.8048611111111111 | 25.419 |
| 0.8055555555555555 | 25.419 |
| 0.80625 | 21.024 |
| 0.8069444444444445 | 21.024 |
| 0.8076388888888889 | 21.024 |
| 0.8083333333333332 | 21.024 |
| 0.8090277777777778 | 16.636 |
| 0.8097222222222222 | 16.636 |
| 0.8104166666666667 | 16.636 |
| 0.811111111111111 | 16.636 |
| 0.8118055555555556 | 16.636 |
| 0.8125 | 12.257 |
| 0.8131944444444444 | 12.257 |
| 0.813888888888889 | 12.257 |
| 0.8145833333333333 | 12.257 |
| 0.8152777777777778 | 12.257 |
| 0.8159722222222222 | 7.887 |
| 0.8166666666666668 | 7.887 |
| 0.8173611111111111 | 7.887 |
| 0.8180555555555555 | 7.887 |
| 0.81875 | 7.887 |
| 0.8194444444444445 | 3.525 |
| 0.8201388888888889 | 3.525 |
| 0.8208333333333333 | 3.525 |
| 0.8215277777777777 | 3.525 |
| 0.8222222222222223 | 3.525 |
| 0.8229166666666666 | 3.525 |
| 0.8236111111111111 | 3.525 |
| 0.8243055555555556 | 3.525 |
| 0.8250000000000001 | 3.525 |
| 0.8256944444444444 | 3.525 |
| 0.8263888888888888 | 3.525 |
| 0.8270833333333334 | 0 |
| 0.8277777777777778 | 0 |
| 0.8284722222222222 | 0 |
| 0.8291666666666666 | 0 |
| 0.8298611111111112 | 0 |
| 0.8305555555555556 | 0 |
| 0.8312499999999999 | 0 |
| 0.8319444444444444 | 0 |
| 0.8326388888888889 | 0 |
| 0.8333333333333334 | 0 |
| 0.8340277777777777 | 0 |
| 0.8347222222222223 | 0 |
| 0.8354166666666667 | 0 |
| 0.8361111111111111 | 0 |
| 0.8368055555555555 | 0 |
| 0.8375 | 0 |
| 0.8381944444444445 | 0 |
| 0.8388888888888889 | 0 |
| 0.8395833333333332 | 0 |
| 0.8402777777777778 | 0 |
| 0.8409722222222222 | 0 |
| 0.8416666666666667 | 0 |
| 0.842361111111111 | 0 |
| 0.8430555555555556 | 0 |
| 0.84375 | 0 |
| 0.8444444444444444 | 0 |
| 0.845138888888889 | 0 |
| 0.8458333333333333 | 0 |
| 0.8465277777777778 | 0 |
| 0.8472222222222222 | 0 |
| 0.8479166666666668 | 0 |
| 0.8486111111111111 | 0 |
| 0.8493055555555555 | 0 |
| 0.85 | 0 |
| 0.8506944444444445 | 0 |
| 0.8513888888888889 | 0 |
| 0.8520833333333333 | 0 |
| 0.8527777777777777 | 0 |
| 0.8534722222222223 | 0 |
| 0.8541666666666666 | 0 |
| 0.8548611111111111 | 0 |
| 0.8555555555555556 | 0 |
| 0.8562500000000001 | 0 |
| 0.8569444444444444 | 0 |
| 0.8576388888888888 | 0 |
| 0.8583333333333334 | 0 |
| 0.8590277777777778 | 0 |
| 0.8597222222222222 | 0 |
| 0.8604166666666666 | 0 |
| 0.8611111111111112 | 0 |
| 0.8618055555555556 | 0 |
| 0.8624999999999999 | 0 |
| 0.8631944444444444 | 0 |
| 0.8638888888888889 | 0 |
| 0.8645833333333334 | 0 |
| 0.8652777777777777 | 0 |
| 0.8659722222222223 | 0 |
| 0.8666666666666667 | 0 |
| 0.8673611111111111 | 0 |
| 0.8680555555555555 | 0 |
| 0.86875 | 0 |
| 0.8694444444444445 | 0 |
| 0.8701388888888889 | 0 |
| 0.8708333333333332 | 0 |
| 0.8715277777777778 | 0 |
| 0.8722222222222222 | 0 |
| 0.8729166666666667 | 0 |
| 0.873611111111111 | 0 |
| 0.8743055555555556 | 0 |
| 0.875 | 0 |
| 0.8756944444444444 | 0 |
| 0.876388888888889 | 0 |
| 0.8770833333333333 | 0 |
| 0.8777777777777778 | 0 |
| 0.8784722222222222 | 0 |
| 0.8791666666666668 | 0 |
| 0.8798611111111111 | 0 |
| 0.8805555555555555 | 0 |
| 0.88125 | 0 |
| 0.8819444444444445 | 0 |
| 0.8826388888888889 | 0 |
| 0.8833333333333333 | 0 |
| 0.8840277777777777 | 0 |
| 0.8847222222222223 | 0 |
| 0.8854166666666666 | 0 |
| 0.8861111111111111 | 0 |
| 0.8868055555555556 | 0 |
| 0.8875000000000001 | 0 |
| 0.8881944444444444 | 0 |
| 0.8888888888888888 | 0 |
| 0.8895833333333334 | 0 |
| 0.8902777777777778 | 0 |
| 0.8909722222222222 | 0 |
| 0.8916666666666666 | 0 |
| 0.8923611111111112 | 0 |
| 0.8930555555555556 | 0 |
| 0.8937499999999999 | 0 |
| 0.8944444444444444 | 0 |
| 0.8951388888888889 | 0 |
| 0.8958333333333334 | 0 |
| 0.8965277777777777 | 0 |
| 0.8972222222222223 | 0 |
| 0.8979166666666667 | 0 |
| 0.8986111111111111 | 0 |
| 0.8993055555555555 | 0 |
| 0.9 | 0 |
| 0.9006944444444445 | 0 |
| 0.9013888888888889 | 0 |
| 0.9020833333333332 | 0 |
| 0.9027777777777778 | 0 |
| 0.9034722222222222 | 0 |
| 0.9041666666666667 | 0 |
| 0.904861111111111 | 0 |
| 0.9055555555555556 | 0 |
| 0.90625 | 0 |
| 0.9069444444444444 | 0 |
| 0.907638888888889 | 0 |
| 0.9083333333333333 | 0 |
| 0.9090277777777778 | 0 |
| 0.9097222222222222 | 0 |
| 0.9104166666666668 | 0 |
| 0.9111111111111111 | 0 |
| 0.9118055555555555 | 0 |
| 0.9125 | 0 |
| 0.9131944444444445 | 0 |
| 0.9138888888888889 | 0 |
| 0.9145833333333333 | 0 |
| 0.9152777777777777 | 0 |
| 0.9159722222222223 | 0 |
| 0.9166666666666666 | 0 |
| 0.9173611111111111 | 0 |
| 0.9180555555555556 | 0 |
| 0.9187500000000001 | 0 |
| 0.9194444444444444 | 0 |
| 0.9201388888888888 | 0 |
| 0.9208333333333334 | 0 |
| 0.9215277777777778 | 0 |
| 0.9222222222222222 | 0 |
| 0.9229166666666666 | 0 |
| 0.9236111111111112 | 0 |
| 0.9243055555555556 | 0 |
| 0.9249999999999999 | 0 |
| 0.9256944444444444 | 0 |
| 0.9263888888888889 | 0 |
| 0.9270833333333334 | 0 |
| 0.9277777777777777 | 0 |
| 0.9284722222222223 | 0 |
| 0.9291666666666667 | 0 |
| 0.9298611111111111 | 0 |
| 0.9305555555555555 | 0 |
| 0.93125 | 0 |
| 0.9319444444444445 | 0 |
| 0.9326388888888889 | 0 |
| 0.9333333333333332 | 0 |
| 0.9340277777777778 | 0 |
| 0.9347222222222222 | 0 |
| 0.9354166666666667 | 0 |
| 0.936111111111111 | 0 |
| 0.9368055555555556 | 0 |
| 0.9375 | 0 |
| 0.9381944444444444 | 0 |
| 0.938888888888889 | 0 |
| 0.9395833333333333 | 0 |
| 0.9402777777777778 | 0 |
| 0.9409722222222222 | 0 |
| 0.9416666666666668 | 0 |
| 0.9423611111111111 | 0 |
| 0.9430555555555555 | 0 |
| 0.94375 | 0 |
| 0.9444444444444445 | 0 |
| 0.9451388888888889 | 0 |
| 0.9458333333333333 | 0 |
| 0.9465277777777777 | 0 |
| 0.9472222222222223 | 0 |
| 0.9479166666666666 | 0 |
| 0.9486111111111111 | 0 |
| 0.9493055555555556 | 0 |
| 0.9500000000000001 | 0 |
| 0.9506944444444444 | 0 |
| 0.9513888888888888 | 0 |
| 0.9520833333333334 | 0 |
| 0.9527777777777778 | 0 |
| 0.9534722222222222 | 0 |
| 0.9541666666666666 | 0 |
| 0.9548611111111112 | 0 |
| 0.9555555555555556 | 0 |
| 0.9562499999999999 | 0 |
| 0.9569444444444444 | 0 |
| 0.9576388888888889 | 0 |
| 0.9583333333333334 | 0 |
| 0.9590277777777777 | 0 |
| 0.9597222222222223 | 0 |
| 0.9604166666666667 | 0 |
| 0.9611111111111111 | 0 |
| 0.9618055555555555 | 0 |
| 0.9625 | 0 |
| 0.9631944444444445 | 0 |
| 0.9638888888888889 | 0 |
| 0.9645833333333332 | 0 |
| 0.9652777777777778 | 0 |
| 0.9659722222222222 | 0 |
| 0.9666666666666667 | 0 |
| 0.967361111111111 | 0 |
| 0.9680555555555556 | 0 |
| 0.96875 | 0 |
| 0.9694444444444444 | 0 |
| 0.970138888888889 | 0 |
| 0.9708333333333333 | 0 |
| 0.9715277777777778 | 0 |
| 0.9722222222222222 | 0 |
| 0.9729166666666668 | 0 |
| 0.9736111111111111 | 0 |
| 0.9743055555555555 | 0 |
| 0.975 | 0 |
| 0.9756944444444445 | 0 |
| 0.9763888888888889 | 0 |
| 0.9770833333333333 | 0 |
| 0.9777777777777777 | 0 |
| 0.9784722222222223 | 0 |
| 0.9791666666666666 | 0 |
| 0.9798611111111111 | 0 |
| 0.9805555555555556 | 0 |
| 0.9812500000000001 | 0 |
| 0.9819444444444444 | 0 |
| 0.9826388888888888 | 0 |
| 0.9833333333333334 | 0 |
| 0.9840277777777778 | 0 |
| 0.9847222222222222 | 0 |
| 0.9854166666666666 | 0 |
| 0.9861111111111112 | 0 |
| 0.9868055555555556 | 0 |
| 0.9874999999999999 | 0 |
| 0.9881944444444444 | 0 |
| 0.9888888888888889 | 0 |
| 0.9895833333333334 | 0 |
| 0.9902777777777777 | 0 |
| 0.9909722222222223 | 0 |
| 0.9916666666666667 | 0 |
| 0.9923611111111111 | 0 |
| 0.9930555555555555 | 0 |
| 0.99375 | 0 |
| 0.9944444444444445 | 0 |
| 0.9951388888888889 | 0 |
| 0.9958333333333332 | 0 |
| 0.9965277777777778 | 0 |
| 0.9972222222222222 | 0 |
| 0.9979166666666667 | 0 |
| 0.998611111111111 | 0 |
| 0.9993055555555556 | 0 |